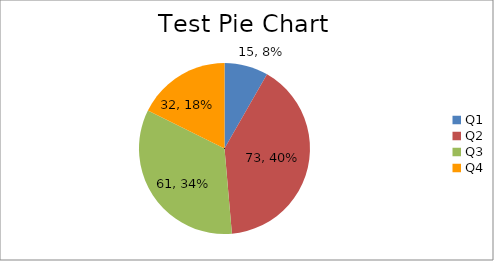
| Category | 2011 |
|---|---|
| Q1 | 15 |
| Q2 | 73 |
| Q3 | 61 |
| Q4 | 32 |